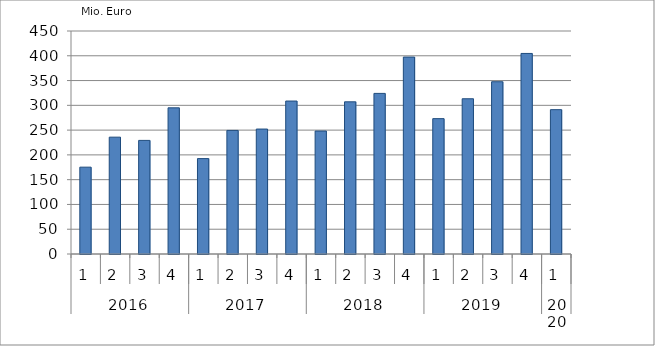
| Category | Ausbaugewerblicher Umsatz3 |
|---|---|
| 0 | 175225.59 |
| 1 | 235781.631 |
| 2 | 229227.559 |
| 3 | 294992.157 |
| 4 | 192499.539 |
| 5 | 249394.388 |
| 6 | 252146.755 |
| 7 | 308653.153 |
| 8 | 248133.418 |
| 9 | 307099.899 |
| 10 | 324088.989 |
| 11 | 397377.201 |
| 12 | 273159.137 |
| 13 | 313254.251 |
| 14 | 347631.281 |
| 15 | 404721.054 |
| 16 | 291272.144 |